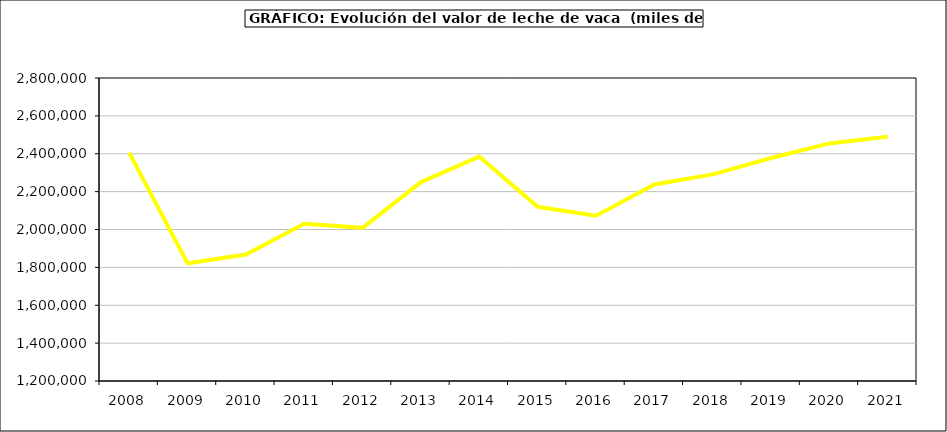
| Category | Leche de vaca |
|---|---|
| 2008.0 | 2406229.051 |
| 2009.0 | 1822023.094 |
| 2010.0 | 1867616.94 |
| 2011.0 | 2029996.881 |
| 2012.0 | 2008801.055 |
| 2013.0 | 2250497.404 |
| 2014.0 | 2384761.493 |
| 2015.0 | 2119762.267 |
| 2016.0 | 2072491.339 |
| 2017.0 | 2237588.977 |
| 2018.0 | 2291136.14 |
| 2019.0 | 2377548.95 |
| 2020.0 | 2454618.621 |
| 2021.0 | 2490439.564 |